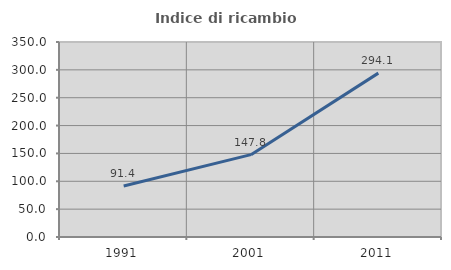
| Category | Indice di ricambio occupazionale  |
|---|---|
| 1991.0 | 91.429 |
| 2001.0 | 147.826 |
| 2011.0 | 294.118 |